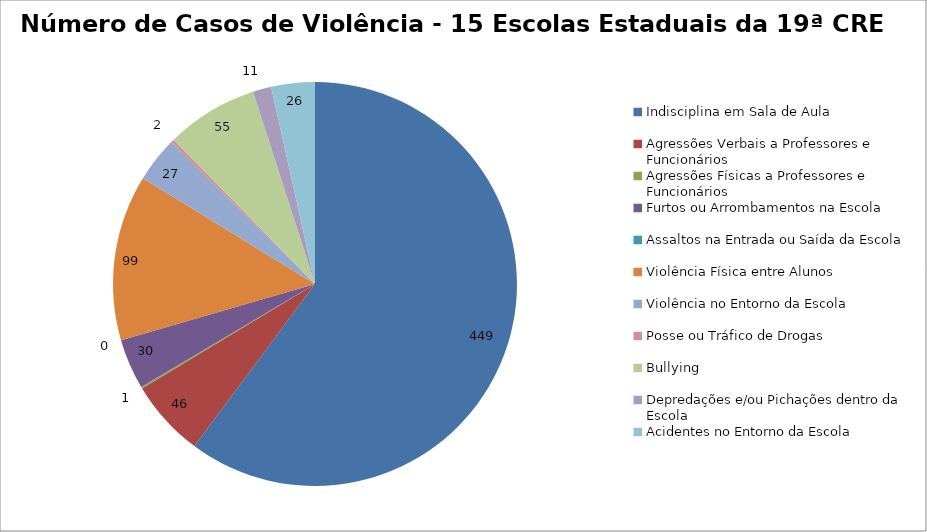
| Category | Número de Casos |
|---|---|
| Indisciplina em Sala de Aula | 449 |
| Agressões Verbais a Professores e Funcionários | 46 |
| Agressões Físicas a Professores e Funcionários | 1 |
| Furtos ou Arrombamentos na Escola | 30 |
| Assaltos na Entrada ou Saída da Escola | 0 |
| Violência Física entre Alunos | 99 |
| Violência no Entorno da Escola | 27 |
| Posse ou Tráfico de Drogas | 2 |
| Bullying | 55 |
| Depredações e/ou Pichações dentro da Escola | 11 |
| Acidentes no Entorno da Escola | 26 |